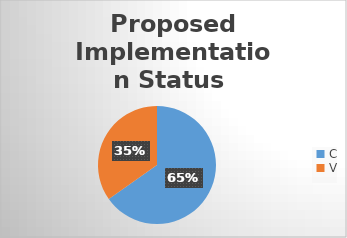
| Category | Series 0 |
|---|---|
| C | 15 |
| V | 8 |